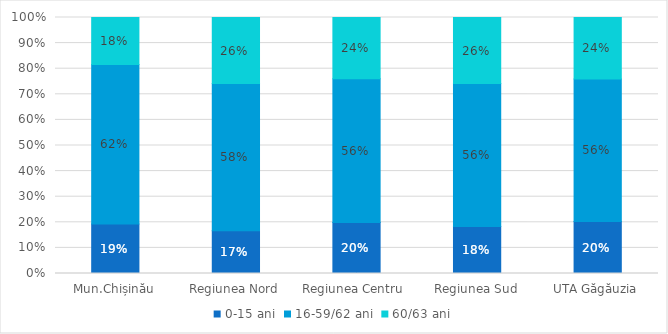
| Category | 0-15 ani | 16-59/62 ani | 60/63 ani |
|---|---|---|---|
| Mun.Chișinău | 0.193 | 0.623 | 0.184 |
| Regiunea Nord | 0.167 | 0.575 | 0.258 |
| Regiunea Centru  | 0.199 | 0.562 | 0.239 |
| Regiunea Sud | 0.184 | 0.558 | 0.258 |
| UTA Găgăuzia | 0.203 | 0.557 | 0.24 |